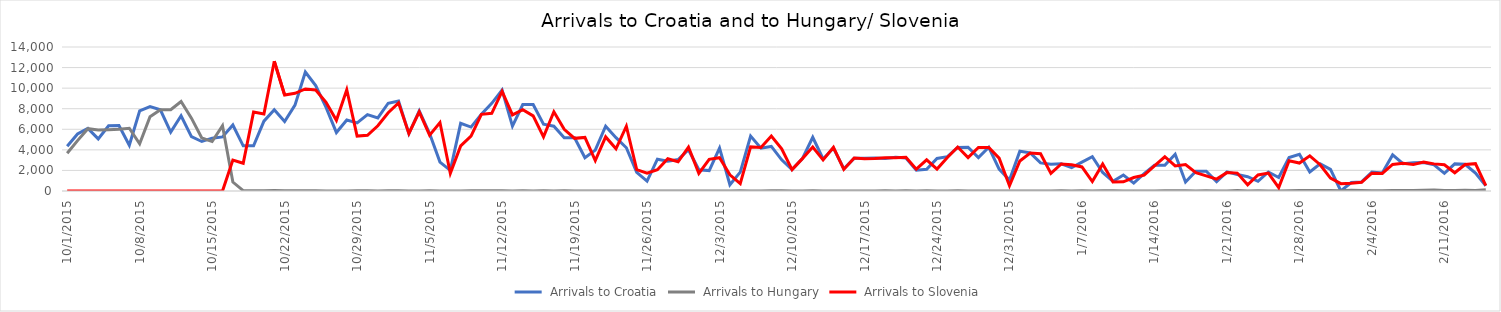
| Category | Arrivals to Croatia | Arrivals to Hungary | Arrivals to Slovenia |
|---|---|---|---|
| 10/1/15 | 4344 | 3667 | 0 |
| 10/2/15 | 5546 | 4897 | 0 |
| 10/3/15 | 6086 | 6056 | 0 |
| 10/4/15 | 5065 | 5925 | 0 |
| 10/5/15 | 6338 | 5952 | 0 |
| 10/6/15 | 6370 | 6000 | 0 |
| 10/7/15 | 4446 | 6103 | 0 |
| 10/8/15 | 7798 | 4583 | 6 |
| 10/9/15 | 8201 | 7215 | 0 |
| 10/10/15 | 7896 | 7907 | 0 |
| 10/11/15 | 5732 | 7897 | 0 |
| 10/12/15 | 7317 | 8702 | 0 |
| 10/13/15 | 5286 | 7081 | 0 |
| 10/14/15 | 4814 | 5157 | 0 |
| 10/15/15 | 5138 | 4808 | 0 |
| 10/16/15 | 5260 | 6353 | 0 |
| 10/17/15 | 6415 | 870 | 3000 |
| 10/18/15 | 4390 | 41 | 2700 |
| 10/19/15 | 4388 | 22 | 7677 |
| 10/20/15 | 6793 | 36 | 7478 |
| 10/21/15 | 7900 | 39 | 12616 |
| 10/22/15 | 6748 | 32 | 9339 |
| 10/23/15 | 8348 | 29 | 9500 |
| 10/24/15 | 11570 | 35 | 9925 |
| 10/25/15 | 10249 | 34 | 9818 |
| 10/26/15 | 8128 | 12 | 8625 |
| 10/27/15 | 5683 | 7 | 6877 |
| 10/28/15 | 6900 | 4 | 9848 |
| 10/29/15 | 6615 | 23 | 5341 |
| 10/30/15 | 7429 | 18 | 5409 |
| 10/31/15 | 7110 | 10 | 6344 |
| 11/1/15 | 8534 | 14 | 7611 |
| 11/2/15 | 8746 | 31 | 8568 |
| 11/3/15 | 5573 | 8 | 5591 |
| 11/4/15 | 7792 | 10 | 7693 |
| 11/5/15 | 5587 | 18 | 5426 |
| 11/6/15 | 2809 | 4 | 6655 |
| 11/7/15 | 2000 | 8 | 1716 |
| 11/8/15 | 6579 | 9 | 4381 |
| 11/9/15 | 6214 | 25 | 5341 |
| 11/10/15 | 7474 | 14 | 7457 |
| 11/11/15 | 8524 | 13 | 7554 |
| 11/12/15 | 9823 | 23 | 9681 |
| 11/13/15 | 6314 | 6 | 7397 |
| 11/14/15 | 8405 | 21 | 7905 |
| 11/15/15 | 8415 | 8 | 7300 |
| 11/16/15 | 6490 | 15 | 5261 |
| 11/17/15 | 6304 | 5 | 7704 |
| 11/18/15 | 5180 | 15 | 5998 |
| 11/19/15 | 5167 | 4 | 5119 |
| 11/20/15 | 3230 | 9 | 5211 |
| 11/21/15 | 3977 | 2 | 2952 |
| 11/22/15 | 6305 | 11 | 5260 |
| 11/23/15 | 5184 | 4 | 4102 |
| 11/24/15 | 4203 | 4 | 6297 |
| 11/25/15 | 1808 | 6 | 2070 |
| 11/26/15 | 952 | 10 | 1742 |
| 11/27/15 | 3095 | 2 | 2065 |
| 11/28/15 | 2886 | 6 | 3139 |
| 11/29/15 | 3060 | 3 | 2843 |
| 11/30/15 | 4009 | 7 | 4274 |
| 12/1/15 | 2066 | 4 | 1709 |
| 12/2/15 | 1982 | 4 | 3077 |
| 12/3/15 | 4174 | 9 | 3237 |
| 12/4/15 | 611 | 1 | 1577 |
| 12/5/15 | 1835 | 31 | 715 |
| 12/6/15 | 5339 | 7 | 4288 |
| 12/7/15 | 4162 | 0 | 4240 |
| 12/8/15 | 4335 | 13 | 5351 |
| 12/9/15 | 3027 | 14 | 4103 |
| 12/10/15 | 2076 | 3 | 2078 |
| 12/11/15 | 3149 | 0 | 3149 |
| 12/12/15 | 5225 | 13 | 4271 |
| 12/13/15 | 3112 | 10 | 3016 |
| 12/14/15 | 4174 | 3 | 4250 |
| 12/15/15 | 2160 | 2 | 2098 |
| 12/16/15 | 3177 | 6 | 3214 |
| 12/17/15 | 3192 | 0 | 3135 |
| 12/18/15 | 3200 | 11 | 3150 |
| 12/19/15 | 3156 | 31 | 3222 |
| 12/20/15 | 3276 | 8 | 3233 |
| 12/21/15 | 3210 | 25 | 3278 |
| 12/22/15 | 2027 | 1 | 2118 |
| 12/23/15 | 2116 | 21 | 3030 |
| 12/24/15 | 3166 | 8 | 2131 |
| 12/25/15 | 3339 | 2 | 3257 |
| 12/26/15 | 4241 | 17 | 4274 |
| 12/27/15 | 4251 | 10 | 3253 |
| 12/28/15 | 3249 | 0 | 4228 |
| 12/29/15 | 4253 | 0 | 4239 |
| 12/30/15 | 2132 | 11 | 3195 |
| 12/31/15 | 1058 | 5 | 511 |
| 1/1/16 | 3869 | 0 | 2914 |
| 1/2/16 | 3710 | 0 | 3690 |
| 1/3/16 | 2732 | 0 | 3619 |
| 1/4/16 | 2591 | 0 | 1708 |
| 1/5/16 | 2650 | 18 | 2626 |
| 1/6/16 | 2273 | 5 | 2550 |
| 1/7/16 | 2814 | 31 | 2337 |
| 1/8/16 | 3332 | 0 | 916 |
| 1/9/16 | 1799 | 15 | 2630 |
| 1/10/16 | 942 | 28 | 880 |
| 1/11/16 | 1549 | 7 | 897 |
| 1/12/16 | 769 | 2 | 1308 |
| 1/13/16 | 1679 | 0 | 1544 |
| 1/14/16 | 2502 | 4 | 2449 |
| 1/15/16 | 2493 | 30 | 3330 |
| 1/16/16 | 3579 | 30 | 2435 |
| 1/17/16 | 878 | 30 | 2570 |
| 1/18/16 | 1930 | 9 | 1783 |
| 1/19/16 | 1917 | 29 | 1476 |
| 1/20/16 | 914 | 0 | 1154 |
| 1/21/16 | 1865 | 10 | 1787 |
| 1/22/16 | 1599 | 47 | 1738 |
| 1/23/16 | 1394 | 10 | 606 |
| 1/24/16 | 946 | 15 | 1564 |
| 1/25/16 | 1847 | 5 | 1746 |
| 1/26/16 | 1309 | 4 | 326 |
| 1/27/16 | 3256 | 36 | 2935 |
| 1/28/16 | 3565 | 51 | 2719 |
| 1/29/16 | 1843 | 38 | 3416 |
| 1/30/16 | 2641 | 38 | 2556 |
| 1/31/16 | 2098 | 38 | 1249 |
| 2/1/16 | 0 | 31 | 716 |
| 2/2/16 | 822 | 69 | 765 |
| 2/3/16 | 881 | 46 | 841 |
| 2/4/16 | 1836 | 31 | 1733 |
| 2/5/16 | 1750 | 19 | 1713 |
| 2/6/16 | 3510 | 49 | 2580 |
| 2/7/16 | 2658 | 53 | 2694 |
| 2/8/16 | 2736 | 48 | 2582 |
| 2/9/16 | 2764 | 72 | 2805 |
| 2/10/16 | 2544 | 104 | 2637 |
| 2/11/16 | 1716 | 54 | 2547 |
| 2/12/16 | 2635 | 39 | 1774 |
| 2/13/16 | 2595 | 66 | 2576 |
| 2/14/16 | 1749 | 51 | 2660 |
| 2/15/16 | 512 | 119 | 516 |